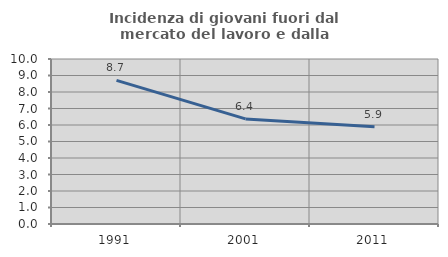
| Category | Incidenza di giovani fuori dal mercato del lavoro e dalla formazione  |
|---|---|
| 1991.0 | 8.705 |
| 2001.0 | 6.369 |
| 2011.0 | 5.895 |